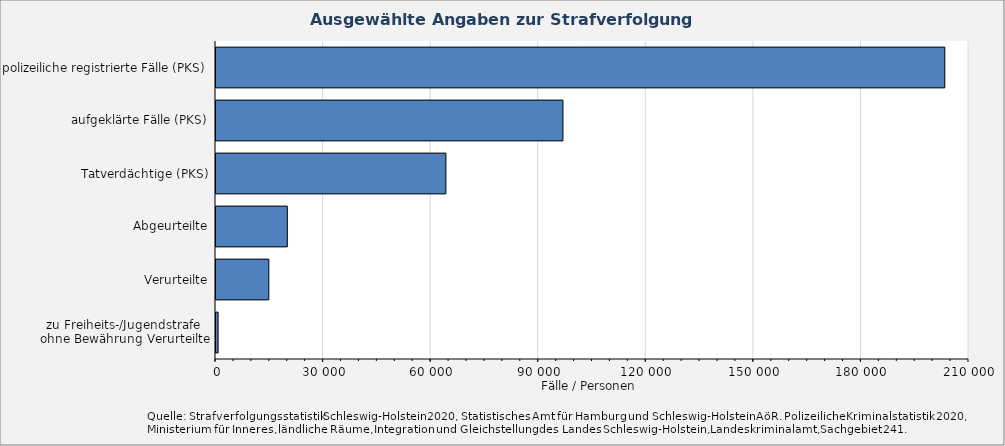
| Category | Fälle / Personen |
|---|---|
| polizeiliche registrierte Fälle (PKS) | 203526 |
| aufgeklärte Fälle (PKS) | 97036 |
| Tatverdächtige (PKS) | 64397 |
| Abgeurteilte | 20169 |
| Verurteilte | 15008 |
| zu Freiheits-/Jugendstrafe 
ohne Bewährung Verurteilte | 864 |